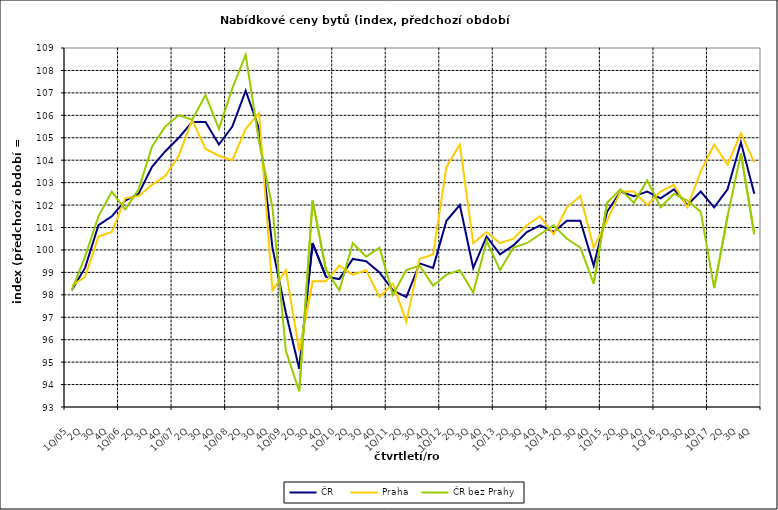
| Category | ČR  | Praha | ČR bez Prahy  |
|---|---|---|---|
| 1Q/05 | 98.2 | 98.4 | 98.2 |
| 2Q | 99.2 | 98.8 | 99.7 |
| 3Q | 101.1 | 100.6 | 101.5 |
| 4Q | 101.5 | 100.8 | 102.6 |
| 1Q/06 | 102.2 | 102.3 | 101.8 |
| 2Q | 102.5 | 102.4 | 102.7 |
| 3Q | 103.7 | 102.9 | 104.6 |
| 4Q | 104.4 | 103.3 | 105.5 |
| 1Q/07 | 105 | 104.2 | 106 |
| 2Q | 105.7 | 105.8 | 105.8 |
| 3Q | 105.7 | 104.5 | 106.9 |
| 4Q | 104.7 | 104.2 | 105.4 |
| 1Q/08 | 105.5 | 104 | 107.2 |
| 2Q | 107.1 | 105.4 | 108.7 |
| 3Q | 105.4 | 106.1 | 104.8 |
| 4Q | 100.1 | 98.2 | 101.9 |
| 1Q/09 | 97.2 | 99.1 | 95.5 |
| 2Q | 94.7 | 95.5 | 93.7 |
| 3Q | 100.3 | 98.6 | 102.2 |
| 4Q | 98.8 | 98.6 | 99.1 |
| 1Q/10 | 98.7 | 99.3 | 98.2 |
| 2Q | 99.6 | 98.9 | 100.3 |
| 3Q | 99.5 | 99.1 | 99.7 |
| 4Q | 99 | 97.9 | 100.1 |
| 1Q/11 | 98.2 | 98.5 | 98 |
| 2Q | 97.9 | 96.8 | 99.1 |
| 3Q | 99.4 | 99.6 | 99.3 |
| 4Q | 99.2 | 99.8 | 98.4 |
| 1Q/12 | 101.3 | 103.7 | 98.9 |
| 2Q | 102 | 104.7 | 99.1 |
| 3Q | 99.2 | 100.3 | 98.1 |
| 4Q | 100.6 | 100.8 | 100.4 |
| 1Q/13 | 99.8 | 100.3 | 99.1 |
| 2Q | 100.2 | 100.5 | 100.1 |
| 3Q | 100.8 | 101.1 | 100.3 |
| 4Q | 101.1 | 101.5 | 100.7 |
| 1Q/14 | 100.8 | 100.7 | 101.1 |
| 2Q | 101.3 | 101.9 | 100.5 |
| 3Q | 101.3 | 102.4 | 100.1 |
| 4Q | 99.3 | 100.1 | 98.5 |
| 1Q/15 | 101.7 | 101.3 | 102.1 |
| 2Q | 102.6 | 102.6 | 102.7 |
| 3Q | 102.4 | 102.6 | 102.1 |
| 4Q | 102.6 | 102 | 103.1 |
| 1Q/16 | 102.3 | 102.6 | 101.9 |
| 2Q | 102.7 | 102.9 | 102.5 |
| 3Q | 102 | 101.9 | 102.2 |
| 4Q | 102.6 | 103.5 | 101.7 |
| 1Q/17 | 101.9 | 104.7 | 98.3 |
| 2Q | 102.7 | 103.8 | 101.5 |
| 3Q | 104.8 | 105.2 | 104.3 |
| 4Q | 102.5 | 103.9 | 100.7 |